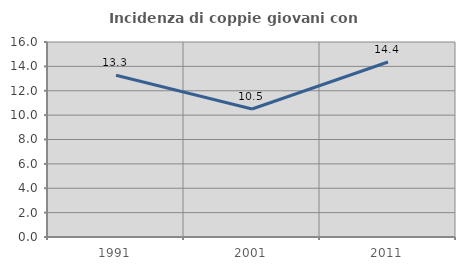
| Category | Incidenza di coppie giovani con figli |
|---|---|
| 1991.0 | 13.274 |
| 2001.0 | 10.5 |
| 2011.0 | 14.362 |